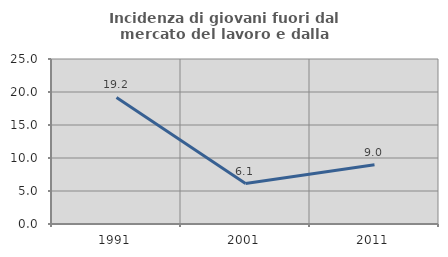
| Category | Incidenza di giovani fuori dal mercato del lavoro e dalla formazione  |
|---|---|
| 1991.0 | 19.184 |
| 2001.0 | 6.135 |
| 2011.0 | 8.974 |